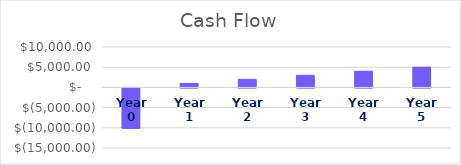
| Category | Cash Flow |
|---|---|
| Year 0 | -10000 |
| Year 1 | 1000 |
| Year 2 | 2000 |
| Year 3 | 3000 |
| Year 4 | 4000 |
| Year 5 | 5000 |